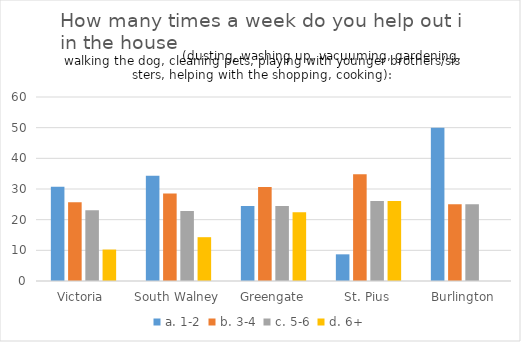
| Category | a. | b. | c. | d. |
|---|---|---|---|---|
| Victoria  | 30.769 | 25.641 | 23.077 | 10.256 |
| South Walney | 34.286 | 28.571 | 22.857 | 14.286 |
| Greengate | 24.49 | 30.612 | 24.49 | 22.449 |
| St. Pius | 8.696 | 34.783 | 26.087 | 26.087 |
| Burlington | 50 | 25 | 25 | 0 |